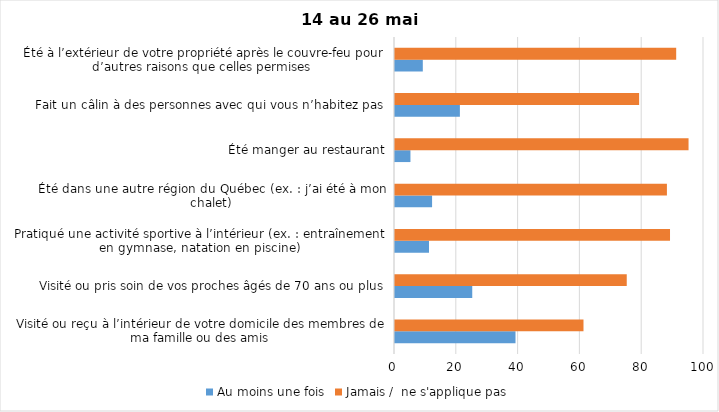
| Category | Au moins une fois | Jamais /  ne s'applique pas |
|---|---|---|
| Visité ou reçu à l’intérieur de votre domicile des membres de ma famille ou des amis | 39 | 61 |
| Visité ou pris soin de vos proches âgés de 70 ans ou plus | 25 | 75 |
| Pratiqué une activité sportive à l’intérieur (ex. : entraînement en gymnase, natation en piscine) | 11 | 89 |
| Été dans une autre région du Québec (ex. : j’ai été à mon chalet) | 12 | 88 |
| Été manger au restaurant | 5 | 95 |
| Fait un câlin à des personnes avec qui vous n’habitez pas | 21 | 79 |
| Été à l’extérieur de votre propriété après le couvre-feu pour d’autres raisons que celles permises  | 9 | 91 |